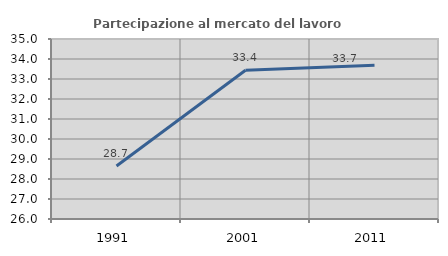
| Category | Partecipazione al mercato del lavoro  femminile |
|---|---|
| 1991.0 | 28.652 |
| 2001.0 | 33.435 |
| 2011.0 | 33.684 |